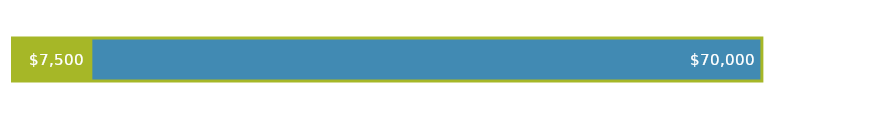
| Category | FINANCIACIÓN TOTAL | GASTOS TOTALES |
|---|---|---|
| 0 | 70000 | 7500 |